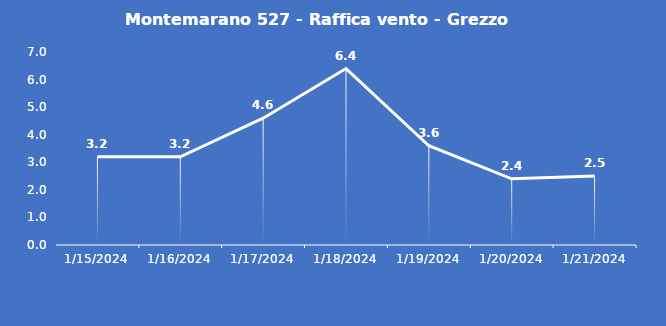
| Category | Montemarano 527 - Raffica vento - Grezzo (m/s) |
|---|---|
| 1/15/24 | 3.2 |
| 1/16/24 | 3.2 |
| 1/17/24 | 4.6 |
| 1/18/24 | 6.4 |
| 1/19/24 | 3.6 |
| 1/20/24 | 2.4 |
| 1/21/24 | 2.5 |